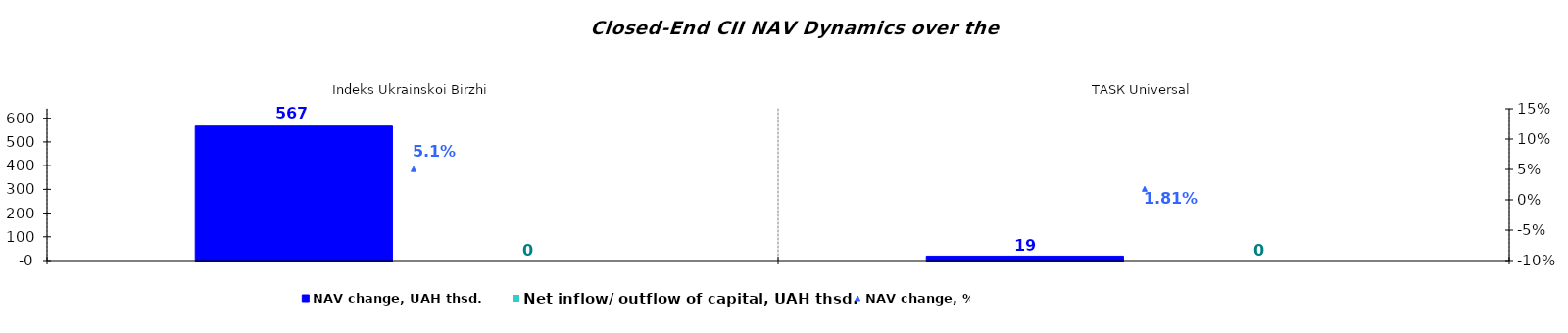
| Category | NAV change, UAH thsd. | Net inflow/ outflow of capital, UAH thsd. |
|---|---|---|
| Іndeks Ukrainskoi Birzhi | 566.92 | 0 |
| ТАSК Universal | 18.887 | 0 |